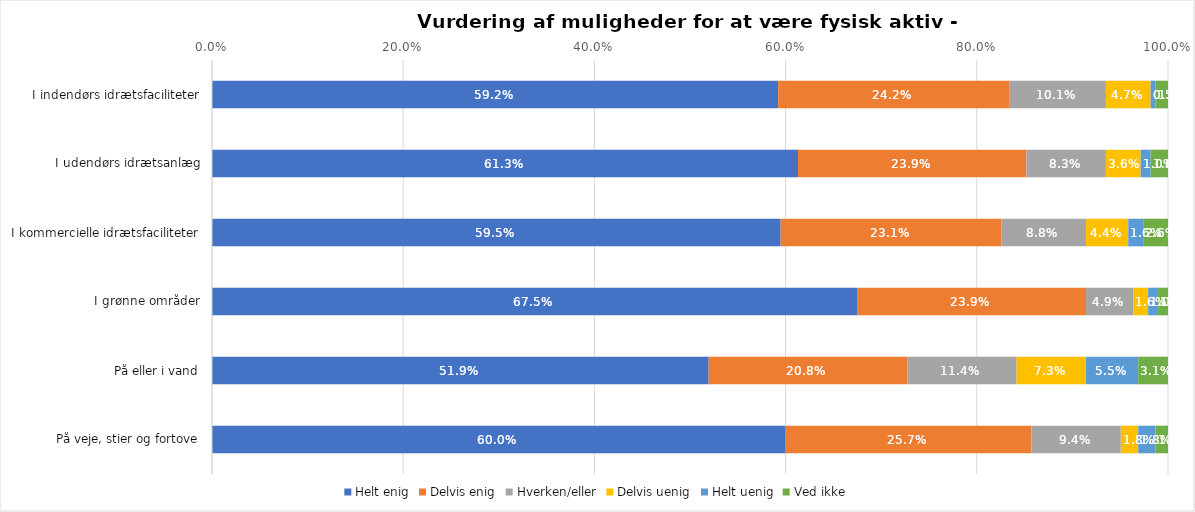
| Category | Helt enig | Delvis enig | Hverken/eller | Delvis uenig | Helt uenig | Ved ikke |
|---|---|---|---|---|---|---|
| I indendørs idrætsfaciliteter | 0.592 | 0.242 | 0.101 | 0.047 | 0.005 | 0.013 |
| I udendørs idrætsanlæg | 0.613 | 0.239 | 0.083 | 0.036 | 0.01 | 0.018 |
| I kommercielle idrætsfaciliteter | 0.595 | 0.231 | 0.088 | 0.044 | 0.016 | 0.026 |
| I grønne områder | 0.675 | 0.239 | 0.049 | 0.016 | 0.01 | 0.01 |
| På eller i vand | 0.519 | 0.208 | 0.114 | 0.073 | 0.055 | 0.031 |
| På veje, stier og fortove | 0.6 | 0.257 | 0.094 | 0.018 | 0.018 | 0.013 |